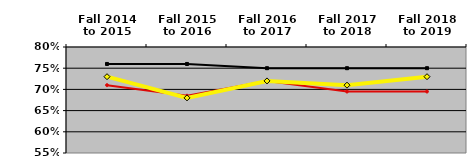
| Category | NATIONAL MEDIAN | WEST MEDIAN | TEXAS LUTHERAN |
|---|---|---|---|
| Fall 2014
to 2015 | 0.76 | 0.71 | 0.73 |
| Fall 2015
to 2016 | 0.76 | 0.685 | 0.68 |
| Fall 2016
to 2017 | 0.75 | 0.72 | 0.72 |
| Fall 2017
to 2018 | 0.75 | 0.695 | 0.71 |
| Fall 2018
to 2019 | 0.75 | 0.695 | 0.73 |